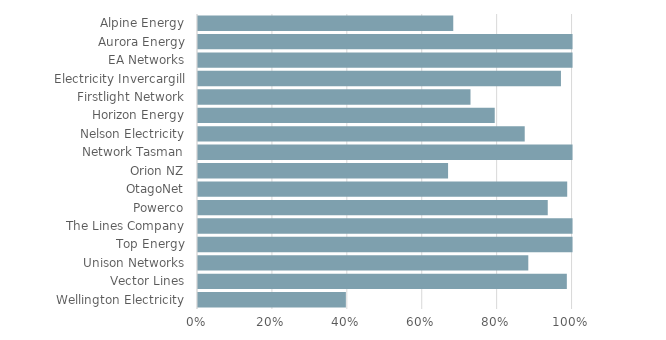
| Category | Series 0 | Series 1 |
|---|---|---|
| Alpine Energy | 0.682 | 1.1 |
| Aurora Energy | 1 | 1.1 |
| EA Networks | 1 | 1.1 |
| Electricity Invercargill | 0.969 | 1.1 |
| Firstlight Network | 0.728 | 1.1 |
| Horizon Energy | 0.792 | 1.1 |
| Nelson Electricity | 0.872 | 1.1 |
| Network Tasman | 1 | 1.1 |
| Orion NZ | 0.668 | 1.1 |
| OtagoNet | 0.986 | 1.1 |
| Powerco | 0.934 | 1.1 |
| The Lines Company | 1 | 1.1 |
| Top Energy | 1 | 1.1 |
| Unison Networks | 0.882 | 1.1 |
| Vector Lines | 0.985 | 1.1 |
| Wellington Electricity | 0.395 | 1.1 |